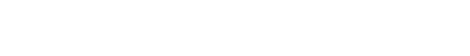
| Category | oui | non | NA |
|---|---|---|---|
| 0.0 | 0 | 0 | 0 |